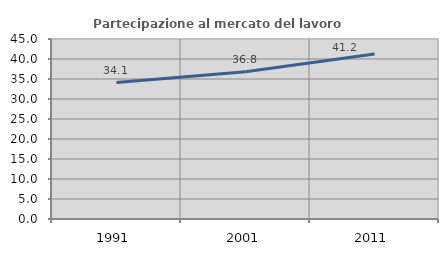
| Category | Partecipazione al mercato del lavoro  femminile |
|---|---|
| 1991.0 | 34.114 |
| 2001.0 | 36.789 |
| 2011.0 | 41.241 |